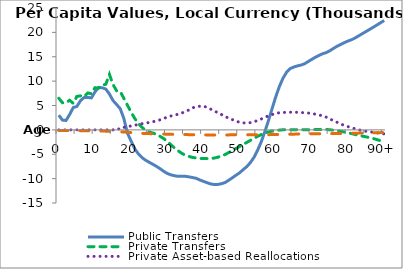
| Category | Public Transfers | Private Transfers | Private Asset-based Reallocations | Public Asset-based Reallocations |
|---|---|---|---|---|
| 0 | 3017.838 | 6484.38 | 0 | -145.82 |
|  | 2007.36 | 5568.683 | 0 | -148.539 |
| 2 | 1936.411 | 5591.981 | 0 | -151.258 |
| 3 | 3154.785 | 6080.086 | 0 | -155.021 |
| 4 | 4579.819 | 5439.827 | 0 | -160.43 |
| 5 | 4816.413 | 6866.909 | 0 | -167.894 |
| 6 | 5999.322 | 6976.732 | 0 | -176.408 |
| 7 | 6635.874 | 6819.09 | 0 | -184.913 |
| 8 | 6657.234 | 7571.781 | 0 | -194.19 |
| 9 | 6552.369 | 7421.486 | 0 | -203.558 |
| 10 | 7774.292 | 8649.994 | 0 | -215.098 |
| 11 | 8704.224 | 8554.165 | 0 | -226.651 |
| 12 | 8636.101 | 9173.822 | 0 | -241.49 |
| 13 | 8373.202 | 9363.508 | 0 | -259.801 |
| 14 | 7348.226 | 11377.301 | 0 | -283.669 |
| 15 | 6012.618 | 9294.209 | 0 | -310.24 |
| 16 | 5193.99 | 8000.285 | 290.549 | -344.966 |
| 17 | 4331.568 | 7853.659 | 113.154 | -386.742 |
| 18 | 2313.388 | 6463.735 | 517.653 | -436.12 |
| 19 | -711.947 | 5041.139 | 662.962 | -493.742 |
| 20 | -2294.653 | 3618.898 | 808.272 | -554.234 |
| 21 | -3888.602 | 2351.946 | 953.937 | -613.318 |
| 22 | -4904.307 | 1311.689 | 1112.693 | -667.938 |
| 23 | -5679.502 | 520.612 | 1274.5 | -711.922 |
| 24 | -6222.418 | -59.776 | 1395.18 | -740.115 |
| 25 | -6648.201 | -418.579 | 1519.117 | -764.701 |
| 26 | -7054.979 | -641.619 | 1659.982 | -788.512 |
| 27 | -7478.673 | -927.218 | 1853.624 | -810.032 |
| 28 | -7958.947 | -1324.351 | 2065.239 | -834.126 |
| 29 | -8486.405 | -1772.408 | 2338.011 | -863.218 |
| 30 | -8937.321 | -2334.374 | 2618.821 | -889.601 |
| 31 | -9224.539 | -3049.29 | 2846.812 | -907.466 |
| 32 | -9404.001 | -3703.054 | 3014.086 | -924.01 |
| 33 | -9528.091 | -4291.798 | 3210.982 | -938.894 |
| 34 | -9501.165 | -4796.925 | 3466.63 | -949.921 |
| 35 | -9527.917 | -5205.275 | 3721.758 | -962.329 |
| 36 | -9634.525 | -5457.742 | 4095.926 | -978.898 |
| 37 | -9780.328 | -5650.238 | 4504.655 | -992.003 |
| 38 | -9934.737 | -5754.416 | 4779.586 | -1001.89 |
| 39 | -10272.472 | -5858.904 | 4843.796 | -1013.262 |
| 40 | -10555.195 | -5886.564 | 4836.263 | -1020.935 |
| 41 | -10833.616 | -5883.139 | 4641.111 | -1028.595 |
| 42 | -11084.201 | -5858.314 | 4253.109 | -1036.815 |
| 43 | -11219.534 | -5783.403 | 3866.495 | -1045.902 |
| 44 | -11188.119 | -5607.354 | 3534.504 | -1050.978 |
| 45 | -11047.482 | -5351.406 | 3143.19 | -1052.398 |
| 46 | -10796.216 | -5049.202 | 2724.398 | -1044.276 |
| 47 | -10334.144 | -4661.014 | 2411.026 | -1030.703 |
| 48 | -9832.116 | -4237.54 | 2109.202 | -1010.426 |
| 49 | -9301.783 | -3817.358 | 1811.754 | -995.736 |
| 50 | -8805.185 | -3424.31 | 1545.244 | -984.757 |
| 51 | -8155.73 | -2991.997 | 1443.593 | -988.087 |
| 52 | -7536.024 | -2568.408 | 1401.296 | -996.95 |
| 53 | -6700.209 | -2153.134 | 1489.274 | -1013.182 |
| 54 | -5617.441 | -1733.242 | 1650.953 | -1021.282 |
| 55 | -4156.278 | -1314.353 | 1944.078 | -1026.132 |
| 56 | -2440.732 | -962.804 | 2231.622 | -1014.274 |
| 57 | -340.924 | -669.3 | 2591.278 | -1000.831 |
| 58 | 1925.553 | -417.565 | 2877.112 | -981.211 |
| 59 | 4357.354 | -235.642 | 3148.048 | -962.814 |
| 60 | 6782.182 | -131.483 | 3355.798 | -944.672 |
| 61 | 8874.367 | -44.972 | 3522.767 | -932.288 |
| 62 | 10587.145 | 19.331 | 3562.27 | -918.27 |
| 63 | 11823.817 | 36.875 | 3605.653 | -904.747 |
| 64 | 12577.907 | 31.47 | 3618.869 | -891.274 |
| 65 | 12891.489 | 44.769 | 3619.886 | -876.703 |
| 66 | 13123.941 | 52.887 | 3606.69 | -862.149 |
| 67 | 13290.919 | 43.45 | 3571.431 | -848.598 |
| 68 | 13566.364 | 44.125 | 3500.605 | -836.218 |
| 69 | 14033.727 | 45.934 | 3449.425 | -823.379 |
| 70 | 14481.883 | 65.198 | 3359.843 | -811.841 |
| 71 | 14919.561 | 56.84 | 3208.219 | -801.682 |
| 72 | 15285.131 | 62.143 | 3049.595 | -790.953 |
| 73 | 15627.835 | 72.934 | 2878.824 | -780.084 |
| 74 | 15853.999 | 79.844 | 2599.14 | -771.429 |
| 75 | 16246.464 | 20.722 | 2231.919 | -762.268 |
| 76 | 16720.213 | -68.02 | 1876.044 | -752.181 |
| 77 | 17168.616 | -167.353 | 1545.353 | -741.381 |
| 78 | 17531.604 | -297.416 | 1201.461 | -730.605 |
| 79 | 17897.528 | -441.473 | 899.977 | -718.731 |
| 80 | 18224.926 | -602.779 | 668.365 | -706.239 |
| 81 | 18504.126 | -769.573 | 442.581 | -693.106 |
| 82 | 18870.751 | -951.875 | 212.967 | -679.393 |
| 83 | 19311.851 | -1112.098 | 6.358 | -665.327 |
| 84 | 19754.492 | -1282.814 | -165.245 | -650.215 |
| 85 | 20186.003 | -1432.184 | -296.259 | -634.885 |
| 86 | 20625.177 | -1590.875 | -399.026 | -616.447 |
| 87 | 21068.895 | -1772.09 | -499.114 | -598.157 |
| 88 | 21519.501 | -1993.94 | -603.296 | -581.319 |
| 89 | 21972.856 | -2229.303 | -710.583 | -563.312 |
| 90+ | 22426.211 | -2464.665 | -817.87 | -545.305 |